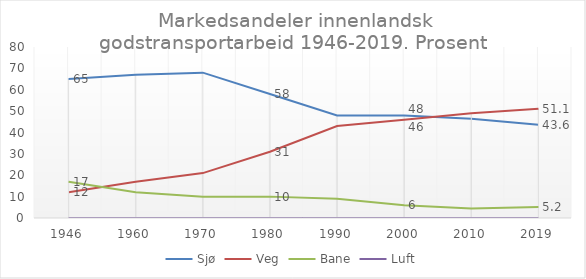
| Category | Sjø | Veg | Bane | Luft |
|---|---|---|---|---|
| 1946.0 | 65 | 12 | 17 | 0 |
| 1960.0 | 67 | 17 | 12 | 0 |
| 1970.0 | 68 | 21 | 10 | 0 |
| 1980.0 | 58 | 31 | 10 | 0 |
| 1990.0 | 48 | 43 | 9 | 0 |
| 2000.0 | 48 | 46 | 6 | 0 |
| 2010.0 | 46.4 | 49 | 4.5 | 0 |
| 2019.0 | 43.6 | 51.1 | 5.2 | 0 |